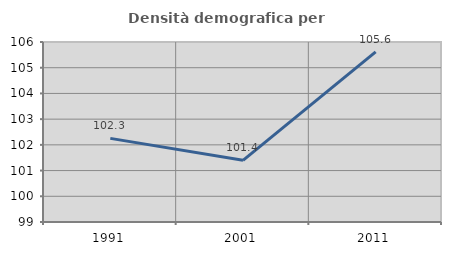
| Category | Densità demografica |
|---|---|
| 1991.0 | 102.252 |
| 2001.0 | 101.399 |
| 2011.0 | 105.614 |